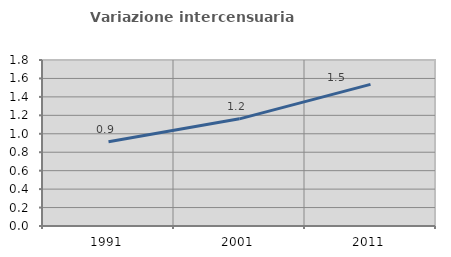
| Category | Variazione intercensuaria annua |
|---|---|
| 1991.0 | 0.913 |
| 2001.0 | 1.162 |
| 2011.0 | 1.536 |